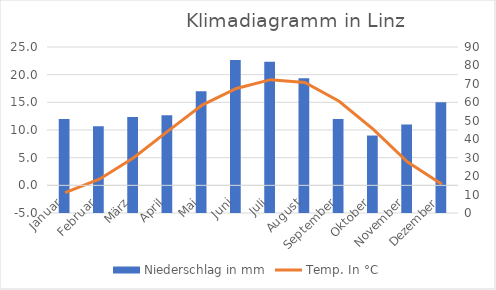
| Category | Niederschlag in mm |
|---|---|
| Januar | 51 |
| Februar | 47 |
| März | 52 |
| April | 53 |
| Mai | 66 |
| Juni | 83 |
| Juli | 82 |
| August | 73 |
| September | 51 |
| Oktober | 42 |
| November | 48 |
| Dezember | 60 |